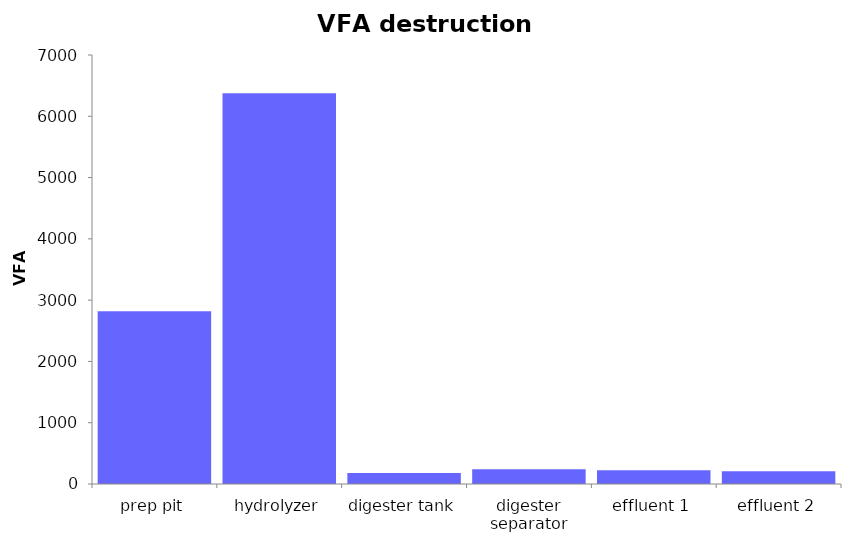
| Category | Series 0 |
|---|---|
| prep pit | 2820 |
| hydrolyzer | 6375 |
| digester tank | 180 |
| digester separator | 240 |
| effluent 1 | 225 |
| effluent 2 | 210 |